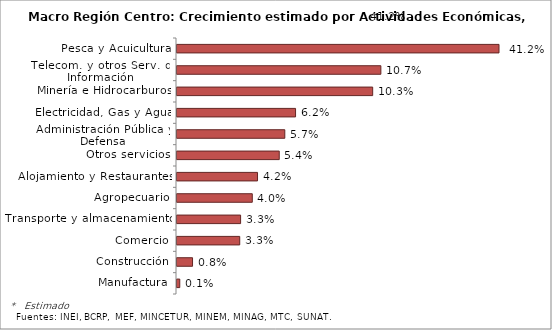
| Category | Series 0 |
|---|---|
| Pesca y Acuicultura | 0.412 |
| Telecom. y otros Serv. de Información | 0.107 |
| Minería e Hidrocarburos | 0.103 |
| Electricidad, Gas y Agua | 0.062 |
| Administración Pública y Defensa | 0.057 |
| Otros servicios | 0.054 |
| Alojamiento y Restaurantes | 0.042 |
| Agropecuario | 0.04 |
| Transporte y almacenamiento | 0.033 |
| Comercio | 0.033 |
| Construcción | 0.008 |
| Manufactura | 0.001 |